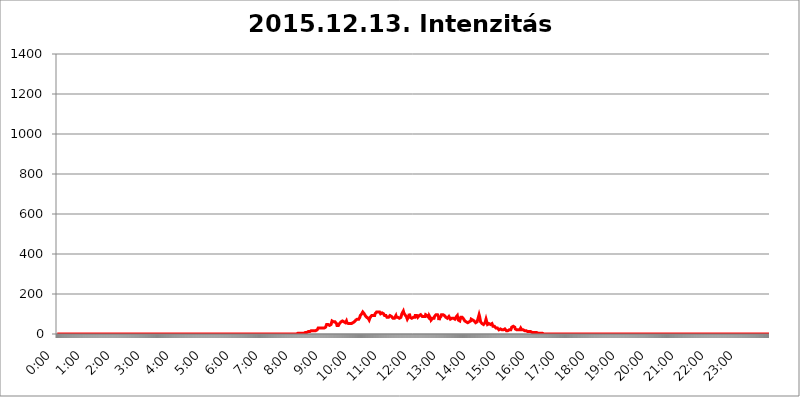
| Category | 2015.12.13. Intenzitás [W/m^2] |
|---|---|
| 0.0 | 0 |
| 0.0006944444444444445 | 0 |
| 0.001388888888888889 | 0 |
| 0.0020833333333333333 | 0 |
| 0.002777777777777778 | 0 |
| 0.003472222222222222 | 0 |
| 0.004166666666666667 | 0 |
| 0.004861111111111111 | 0 |
| 0.005555555555555556 | 0 |
| 0.0062499999999999995 | 0 |
| 0.006944444444444444 | 0 |
| 0.007638888888888889 | 0 |
| 0.008333333333333333 | 0 |
| 0.009027777777777779 | 0 |
| 0.009722222222222222 | 0 |
| 0.010416666666666666 | 0 |
| 0.011111111111111112 | 0 |
| 0.011805555555555555 | 0 |
| 0.012499999999999999 | 0 |
| 0.013194444444444444 | 0 |
| 0.013888888888888888 | 0 |
| 0.014583333333333332 | 0 |
| 0.015277777777777777 | 0 |
| 0.015972222222222224 | 0 |
| 0.016666666666666666 | 0 |
| 0.017361111111111112 | 0 |
| 0.018055555555555557 | 0 |
| 0.01875 | 0 |
| 0.019444444444444445 | 0 |
| 0.02013888888888889 | 0 |
| 0.020833333333333332 | 0 |
| 0.02152777777777778 | 0 |
| 0.022222222222222223 | 0 |
| 0.02291666666666667 | 0 |
| 0.02361111111111111 | 0 |
| 0.024305555555555556 | 0 |
| 0.024999999999999998 | 0 |
| 0.025694444444444447 | 0 |
| 0.02638888888888889 | 0 |
| 0.027083333333333334 | 0 |
| 0.027777777777777776 | 0 |
| 0.02847222222222222 | 0 |
| 0.029166666666666664 | 0 |
| 0.029861111111111113 | 0 |
| 0.030555555555555555 | 0 |
| 0.03125 | 0 |
| 0.03194444444444445 | 0 |
| 0.03263888888888889 | 0 |
| 0.03333333333333333 | 0 |
| 0.034027777777777775 | 0 |
| 0.034722222222222224 | 0 |
| 0.035416666666666666 | 0 |
| 0.036111111111111115 | 0 |
| 0.03680555555555556 | 0 |
| 0.0375 | 0 |
| 0.03819444444444444 | 0 |
| 0.03888888888888889 | 0 |
| 0.03958333333333333 | 0 |
| 0.04027777777777778 | 0 |
| 0.04097222222222222 | 0 |
| 0.041666666666666664 | 0 |
| 0.042361111111111106 | 0 |
| 0.04305555555555556 | 0 |
| 0.043750000000000004 | 0 |
| 0.044444444444444446 | 0 |
| 0.04513888888888889 | 0 |
| 0.04583333333333334 | 0 |
| 0.04652777777777778 | 0 |
| 0.04722222222222222 | 0 |
| 0.04791666666666666 | 0 |
| 0.04861111111111111 | 0 |
| 0.049305555555555554 | 0 |
| 0.049999999999999996 | 0 |
| 0.05069444444444445 | 0 |
| 0.051388888888888894 | 0 |
| 0.052083333333333336 | 0 |
| 0.05277777777777778 | 0 |
| 0.05347222222222222 | 0 |
| 0.05416666666666667 | 0 |
| 0.05486111111111111 | 0 |
| 0.05555555555555555 | 0 |
| 0.05625 | 0 |
| 0.05694444444444444 | 0 |
| 0.057638888888888885 | 0 |
| 0.05833333333333333 | 0 |
| 0.05902777777777778 | 0 |
| 0.059722222222222225 | 0 |
| 0.06041666666666667 | 0 |
| 0.061111111111111116 | 0 |
| 0.06180555555555556 | 0 |
| 0.0625 | 0 |
| 0.06319444444444444 | 0 |
| 0.06388888888888888 | 0 |
| 0.06458333333333334 | 0 |
| 0.06527777777777778 | 0 |
| 0.06597222222222222 | 0 |
| 0.06666666666666667 | 0 |
| 0.06736111111111111 | 0 |
| 0.06805555555555555 | 0 |
| 0.06874999999999999 | 0 |
| 0.06944444444444443 | 0 |
| 0.07013888888888889 | 0 |
| 0.07083333333333333 | 0 |
| 0.07152777777777779 | 0 |
| 0.07222222222222223 | 0 |
| 0.07291666666666667 | 0 |
| 0.07361111111111111 | 0 |
| 0.07430555555555556 | 0 |
| 0.075 | 0 |
| 0.07569444444444444 | 0 |
| 0.0763888888888889 | 0 |
| 0.07708333333333334 | 0 |
| 0.07777777777777778 | 0 |
| 0.07847222222222222 | 0 |
| 0.07916666666666666 | 0 |
| 0.0798611111111111 | 0 |
| 0.08055555555555556 | 0 |
| 0.08125 | 0 |
| 0.08194444444444444 | 0 |
| 0.08263888888888889 | 0 |
| 0.08333333333333333 | 0 |
| 0.08402777777777777 | 0 |
| 0.08472222222222221 | 0 |
| 0.08541666666666665 | 0 |
| 0.08611111111111112 | 0 |
| 0.08680555555555557 | 0 |
| 0.08750000000000001 | 0 |
| 0.08819444444444445 | 0 |
| 0.08888888888888889 | 0 |
| 0.08958333333333333 | 0 |
| 0.09027777777777778 | 0 |
| 0.09097222222222222 | 0 |
| 0.09166666666666667 | 0 |
| 0.09236111111111112 | 0 |
| 0.09305555555555556 | 0 |
| 0.09375 | 0 |
| 0.09444444444444444 | 0 |
| 0.09513888888888888 | 0 |
| 0.09583333333333333 | 0 |
| 0.09652777777777777 | 0 |
| 0.09722222222222222 | 0 |
| 0.09791666666666667 | 0 |
| 0.09861111111111111 | 0 |
| 0.09930555555555555 | 0 |
| 0.09999999999999999 | 0 |
| 0.10069444444444443 | 0 |
| 0.1013888888888889 | 0 |
| 0.10208333333333335 | 0 |
| 0.10277777777777779 | 0 |
| 0.10347222222222223 | 0 |
| 0.10416666666666667 | 0 |
| 0.10486111111111111 | 0 |
| 0.10555555555555556 | 0 |
| 0.10625 | 0 |
| 0.10694444444444444 | 0 |
| 0.1076388888888889 | 0 |
| 0.10833333333333334 | 0 |
| 0.10902777777777778 | 0 |
| 0.10972222222222222 | 0 |
| 0.1111111111111111 | 0 |
| 0.11180555555555556 | 0 |
| 0.11180555555555556 | 0 |
| 0.1125 | 0 |
| 0.11319444444444444 | 0 |
| 0.11388888888888889 | 0 |
| 0.11458333333333333 | 0 |
| 0.11527777777777777 | 0 |
| 0.11597222222222221 | 0 |
| 0.11666666666666665 | 0 |
| 0.1173611111111111 | 0 |
| 0.11805555555555557 | 0 |
| 0.11944444444444445 | 0 |
| 0.12013888888888889 | 0 |
| 0.12083333333333333 | 0 |
| 0.12152777777777778 | 0 |
| 0.12222222222222223 | 0 |
| 0.12291666666666667 | 0 |
| 0.12291666666666667 | 0 |
| 0.12361111111111112 | 0 |
| 0.12430555555555556 | 0 |
| 0.125 | 0 |
| 0.12569444444444444 | 0 |
| 0.12638888888888888 | 0 |
| 0.12708333333333333 | 0 |
| 0.16875 | 0 |
| 0.12847222222222224 | 0 |
| 0.12916666666666668 | 0 |
| 0.12986111111111112 | 0 |
| 0.13055555555555556 | 0 |
| 0.13125 | 0 |
| 0.13194444444444445 | 0 |
| 0.1326388888888889 | 0 |
| 0.13333333333333333 | 0 |
| 0.13402777777777777 | 0 |
| 0.13402777777777777 | 0 |
| 0.13472222222222222 | 0 |
| 0.13541666666666666 | 0 |
| 0.1361111111111111 | 0 |
| 0.13749999999999998 | 0 |
| 0.13819444444444443 | 0 |
| 0.1388888888888889 | 0 |
| 0.13958333333333334 | 0 |
| 0.14027777777777778 | 0 |
| 0.14097222222222222 | 0 |
| 0.14166666666666666 | 0 |
| 0.1423611111111111 | 0 |
| 0.14305555555555557 | 0 |
| 0.14375000000000002 | 0 |
| 0.14444444444444446 | 0 |
| 0.1451388888888889 | 0 |
| 0.1451388888888889 | 0 |
| 0.14652777777777778 | 0 |
| 0.14722222222222223 | 0 |
| 0.14791666666666667 | 0 |
| 0.1486111111111111 | 0 |
| 0.14930555555555555 | 0 |
| 0.15 | 0 |
| 0.15069444444444444 | 0 |
| 0.15138888888888888 | 0 |
| 0.15208333333333332 | 0 |
| 0.15277777777777776 | 0 |
| 0.15347222222222223 | 0 |
| 0.15416666666666667 | 0 |
| 0.15486111111111112 | 0 |
| 0.15555555555555556 | 0 |
| 0.15625 | 0 |
| 0.15694444444444444 | 0 |
| 0.15763888888888888 | 0 |
| 0.15833333333333333 | 0 |
| 0.15902777777777777 | 0 |
| 0.15972222222222224 | 0 |
| 0.16041666666666668 | 0 |
| 0.16111111111111112 | 0 |
| 0.16180555555555556 | 0 |
| 0.1625 | 0 |
| 0.16319444444444445 | 0 |
| 0.1638888888888889 | 0 |
| 0.16458333333333333 | 0 |
| 0.16527777777777777 | 0 |
| 0.16597222222222222 | 0 |
| 0.16666666666666666 | 0 |
| 0.1673611111111111 | 0 |
| 0.16805555555555554 | 0 |
| 0.16874999999999998 | 0 |
| 0.16944444444444443 | 0 |
| 0.17013888888888887 | 0 |
| 0.1708333333333333 | 0 |
| 0.17152777777777775 | 0 |
| 0.17222222222222225 | 0 |
| 0.1729166666666667 | 0 |
| 0.17361111111111113 | 0 |
| 0.17430555555555557 | 0 |
| 0.17500000000000002 | 0 |
| 0.17569444444444446 | 0 |
| 0.1763888888888889 | 0 |
| 0.17708333333333334 | 0 |
| 0.17777777777777778 | 0 |
| 0.17847222222222223 | 0 |
| 0.17916666666666667 | 0 |
| 0.1798611111111111 | 0 |
| 0.18055555555555555 | 0 |
| 0.18125 | 0 |
| 0.18194444444444444 | 0 |
| 0.1826388888888889 | 0 |
| 0.18333333333333335 | 0 |
| 0.1840277777777778 | 0 |
| 0.18472222222222223 | 0 |
| 0.18541666666666667 | 0 |
| 0.18611111111111112 | 0 |
| 0.18680555555555556 | 0 |
| 0.1875 | 0 |
| 0.18819444444444444 | 0 |
| 0.18888888888888888 | 0 |
| 0.18958333333333333 | 0 |
| 0.19027777777777777 | 0 |
| 0.1909722222222222 | 0 |
| 0.19166666666666665 | 0 |
| 0.19236111111111112 | 0 |
| 0.19305555555555554 | 0 |
| 0.19375 | 0 |
| 0.19444444444444445 | 0 |
| 0.1951388888888889 | 0 |
| 0.19583333333333333 | 0 |
| 0.19652777777777777 | 0 |
| 0.19722222222222222 | 0 |
| 0.19791666666666666 | 0 |
| 0.1986111111111111 | 0 |
| 0.19930555555555554 | 0 |
| 0.19999999999999998 | 0 |
| 0.20069444444444443 | 0 |
| 0.20138888888888887 | 0 |
| 0.2020833333333333 | 0 |
| 0.2027777777777778 | 0 |
| 0.2034722222222222 | 0 |
| 0.2041666666666667 | 0 |
| 0.20486111111111113 | 0 |
| 0.20555555555555557 | 0 |
| 0.20625000000000002 | 0 |
| 0.20694444444444446 | 0 |
| 0.2076388888888889 | 0 |
| 0.20833333333333334 | 0 |
| 0.20902777777777778 | 0 |
| 0.20972222222222223 | 0 |
| 0.21041666666666667 | 0 |
| 0.2111111111111111 | 0 |
| 0.21180555555555555 | 0 |
| 0.2125 | 0 |
| 0.21319444444444444 | 0 |
| 0.2138888888888889 | 0 |
| 0.21458333333333335 | 0 |
| 0.2152777777777778 | 0 |
| 0.21597222222222223 | 0 |
| 0.21666666666666667 | 0 |
| 0.21736111111111112 | 0 |
| 0.21805555555555556 | 0 |
| 0.21875 | 0 |
| 0.21944444444444444 | 0 |
| 0.22013888888888888 | 0 |
| 0.22083333333333333 | 0 |
| 0.22152777777777777 | 0 |
| 0.2222222222222222 | 0 |
| 0.22291666666666665 | 0 |
| 0.2236111111111111 | 0 |
| 0.22430555555555556 | 0 |
| 0.225 | 0 |
| 0.22569444444444445 | 0 |
| 0.2263888888888889 | 0 |
| 0.22708333333333333 | 0 |
| 0.22777777777777777 | 0 |
| 0.22847222222222222 | 0 |
| 0.22916666666666666 | 0 |
| 0.2298611111111111 | 0 |
| 0.23055555555555554 | 0 |
| 0.23124999999999998 | 0 |
| 0.23194444444444443 | 0 |
| 0.23263888888888887 | 0 |
| 0.2333333333333333 | 0 |
| 0.2340277777777778 | 0 |
| 0.2347222222222222 | 0 |
| 0.2354166666666667 | 0 |
| 0.23611111111111113 | 0 |
| 0.23680555555555557 | 0 |
| 0.23750000000000002 | 0 |
| 0.23819444444444446 | 0 |
| 0.2388888888888889 | 0 |
| 0.23958333333333334 | 0 |
| 0.24027777777777778 | 0 |
| 0.24097222222222223 | 0 |
| 0.24166666666666667 | 0 |
| 0.2423611111111111 | 0 |
| 0.24305555555555555 | 0 |
| 0.24375 | 0 |
| 0.24444444444444446 | 0 |
| 0.24513888888888888 | 0 |
| 0.24583333333333335 | 0 |
| 0.2465277777777778 | 0 |
| 0.24722222222222223 | 0 |
| 0.24791666666666667 | 0 |
| 0.24861111111111112 | 0 |
| 0.24930555555555556 | 0 |
| 0.25 | 0 |
| 0.25069444444444444 | 0 |
| 0.2513888888888889 | 0 |
| 0.2520833333333333 | 0 |
| 0.25277777777777777 | 0 |
| 0.2534722222222222 | 0 |
| 0.25416666666666665 | 0 |
| 0.2548611111111111 | 0 |
| 0.2555555555555556 | 0 |
| 0.25625000000000003 | 0 |
| 0.2569444444444445 | 0 |
| 0.2576388888888889 | 0 |
| 0.25833333333333336 | 0 |
| 0.2590277777777778 | 0 |
| 0.25972222222222224 | 0 |
| 0.2604166666666667 | 0 |
| 0.2611111111111111 | 0 |
| 0.26180555555555557 | 0 |
| 0.2625 | 0 |
| 0.26319444444444445 | 0 |
| 0.2638888888888889 | 0 |
| 0.26458333333333334 | 0 |
| 0.2652777777777778 | 0 |
| 0.2659722222222222 | 0 |
| 0.26666666666666666 | 0 |
| 0.2673611111111111 | 0 |
| 0.26805555555555555 | 0 |
| 0.26875 | 0 |
| 0.26944444444444443 | 0 |
| 0.2701388888888889 | 0 |
| 0.2708333333333333 | 0 |
| 0.27152777777777776 | 0 |
| 0.2722222222222222 | 0 |
| 0.27291666666666664 | 0 |
| 0.2736111111111111 | 0 |
| 0.2743055555555555 | 0 |
| 0.27499999999999997 | 0 |
| 0.27569444444444446 | 0 |
| 0.27638888888888885 | 0 |
| 0.27708333333333335 | 0 |
| 0.2777777777777778 | 0 |
| 0.27847222222222223 | 0 |
| 0.2791666666666667 | 0 |
| 0.2798611111111111 | 0 |
| 0.28055555555555556 | 0 |
| 0.28125 | 0 |
| 0.28194444444444444 | 0 |
| 0.2826388888888889 | 0 |
| 0.2833333333333333 | 0 |
| 0.28402777777777777 | 0 |
| 0.2847222222222222 | 0 |
| 0.28541666666666665 | 0 |
| 0.28611111111111115 | 0 |
| 0.28680555555555554 | 0 |
| 0.28750000000000003 | 0 |
| 0.2881944444444445 | 0 |
| 0.2888888888888889 | 0 |
| 0.28958333333333336 | 0 |
| 0.2902777777777778 | 0 |
| 0.29097222222222224 | 0 |
| 0.2916666666666667 | 0 |
| 0.2923611111111111 | 0 |
| 0.29305555555555557 | 0 |
| 0.29375 | 0 |
| 0.29444444444444445 | 0 |
| 0.2951388888888889 | 0 |
| 0.29583333333333334 | 0 |
| 0.2965277777777778 | 0 |
| 0.2972222222222222 | 0 |
| 0.29791666666666666 | 0 |
| 0.2986111111111111 | 0 |
| 0.29930555555555555 | 0 |
| 0.3 | 0 |
| 0.30069444444444443 | 0 |
| 0.3013888888888889 | 0 |
| 0.3020833333333333 | 0 |
| 0.30277777777777776 | 0 |
| 0.3034722222222222 | 0 |
| 0.30416666666666664 | 0 |
| 0.3048611111111111 | 0 |
| 0.3055555555555555 | 0 |
| 0.30624999999999997 | 0 |
| 0.3069444444444444 | 0 |
| 0.3076388888888889 | 0 |
| 0.30833333333333335 | 0 |
| 0.3090277777777778 | 0 |
| 0.30972222222222223 | 0 |
| 0.3104166666666667 | 0 |
| 0.3111111111111111 | 0 |
| 0.31180555555555556 | 0 |
| 0.3125 | 0 |
| 0.31319444444444444 | 0 |
| 0.3138888888888889 | 0 |
| 0.3145833333333333 | 0 |
| 0.31527777777777777 | 0 |
| 0.3159722222222222 | 0 |
| 0.31666666666666665 | 0 |
| 0.31736111111111115 | 0 |
| 0.31805555555555554 | 0 |
| 0.31875000000000003 | 0 |
| 0.3194444444444445 | 0 |
| 0.3201388888888889 | 0 |
| 0.32083333333333336 | 0 |
| 0.3215277777777778 | 0 |
| 0.32222222222222224 | 0 |
| 0.3229166666666667 | 0 |
| 0.3236111111111111 | 0 |
| 0.32430555555555557 | 0 |
| 0.325 | 0 |
| 0.32569444444444445 | 0 |
| 0.3263888888888889 | 0 |
| 0.32708333333333334 | 0 |
| 0.3277777777777778 | 0 |
| 0.3284722222222222 | 0 |
| 0.32916666666666666 | 0 |
| 0.3298611111111111 | 0 |
| 0.33055555555555555 | 0 |
| 0.33125 | 0 |
| 0.33194444444444443 | 0 |
| 0.3326388888888889 | 0 |
| 0.3333333333333333 | 0 |
| 0.3340277777777778 | 0 |
| 0.3347222222222222 | 0 |
| 0.3354166666666667 | 0 |
| 0.3361111111111111 | 0 |
| 0.3368055555555556 | 0 |
| 0.33749999999999997 | 3.525 |
| 0.33819444444444446 | 3.525 |
| 0.33888888888888885 | 3.525 |
| 0.33958333333333335 | 3.525 |
| 0.34027777777777773 | 3.525 |
| 0.34097222222222223 | 3.525 |
| 0.3416666666666666 | 3.525 |
| 0.3423611111111111 | 3.525 |
| 0.3430555555555555 | 3.525 |
| 0.34375 | 3.525 |
| 0.3444444444444445 | 3.525 |
| 0.3451388888888889 | 7.887 |
| 0.3458333333333334 | 3.525 |
| 0.34652777777777777 | 7.887 |
| 0.34722222222222227 | 7.887 |
| 0.34791666666666665 | 7.887 |
| 0.34861111111111115 | 7.887 |
| 0.34930555555555554 | 7.887 |
| 0.35000000000000003 | 7.887 |
| 0.3506944444444444 | 7.887 |
| 0.3513888888888889 | 12.257 |
| 0.3520833333333333 | 12.257 |
| 0.3527777777777778 | 12.257 |
| 0.3534722222222222 | 12.257 |
| 0.3541666666666667 | 12.257 |
| 0.3548611111111111 | 16.636 |
| 0.35555555555555557 | 16.636 |
| 0.35625 | 16.636 |
| 0.35694444444444445 | 16.636 |
| 0.3576388888888889 | 16.636 |
| 0.35833333333333334 | 16.636 |
| 0.3590277777777778 | 16.636 |
| 0.3597222222222222 | 16.636 |
| 0.36041666666666666 | 16.636 |
| 0.3611111111111111 | 16.636 |
| 0.36180555555555555 | 16.636 |
| 0.3625 | 16.636 |
| 0.36319444444444443 | 16.636 |
| 0.3638888888888889 | 16.636 |
| 0.3645833333333333 | 21.024 |
| 0.3652777777777778 | 21.024 |
| 0.3659722222222222 | 29.823 |
| 0.3666666666666667 | 29.823 |
| 0.3673611111111111 | 29.823 |
| 0.3680555555555556 | 29.823 |
| 0.36874999999999997 | 29.823 |
| 0.36944444444444446 | 29.823 |
| 0.37013888888888885 | 29.823 |
| 0.37083333333333335 | 29.823 |
| 0.37152777777777773 | 29.823 |
| 0.37222222222222223 | 29.823 |
| 0.3729166666666666 | 29.823 |
| 0.3736111111111111 | 29.823 |
| 0.3743055555555555 | 29.823 |
| 0.375 | 34.234 |
| 0.3756944444444445 | 29.823 |
| 0.3763888888888889 | 34.234 |
| 0.3770833333333334 | 38.653 |
| 0.37777777777777777 | 47.511 |
| 0.37847222222222227 | 51.951 |
| 0.37916666666666665 | 51.951 |
| 0.37986111111111115 | 47.511 |
| 0.38055555555555554 | 43.079 |
| 0.38125000000000003 | 43.079 |
| 0.3819444444444444 | 43.079 |
| 0.3826388888888889 | 47.511 |
| 0.3833333333333333 | 47.511 |
| 0.3840277777777778 | 47.511 |
| 0.3847222222222222 | 56.398 |
| 0.3854166666666667 | 65.31 |
| 0.3861111111111111 | 69.775 |
| 0.38680555555555557 | 60.85 |
| 0.3875 | 60.85 |
| 0.38819444444444445 | 65.31 |
| 0.3888888888888889 | 56.398 |
| 0.38958333333333334 | 60.85 |
| 0.3902777777777778 | 65.31 |
| 0.3909722222222222 | 56.398 |
| 0.39166666666666666 | 51.951 |
| 0.3923611111111111 | 43.079 |
| 0.39305555555555555 | 43.079 |
| 0.39375 | 43.079 |
| 0.39444444444444443 | 43.079 |
| 0.3951388888888889 | 47.511 |
| 0.3958333333333333 | 51.951 |
| 0.3965277777777778 | 51.951 |
| 0.3972222222222222 | 56.398 |
| 0.3979166666666667 | 60.85 |
| 0.3986111111111111 | 60.85 |
| 0.3993055555555556 | 60.85 |
| 0.39999999999999997 | 65.31 |
| 0.40069444444444446 | 65.31 |
| 0.40138888888888885 | 65.31 |
| 0.40208333333333335 | 60.85 |
| 0.40277777777777773 | 56.398 |
| 0.40347222222222223 | 56.398 |
| 0.4041666666666666 | 56.398 |
| 0.4048611111111111 | 56.398 |
| 0.4055555555555555 | 65.31 |
| 0.40625 | 56.398 |
| 0.4069444444444445 | 60.85 |
| 0.4076388888888889 | 56.398 |
| 0.4083333333333334 | 51.951 |
| 0.40902777777777777 | 51.951 |
| 0.40972222222222227 | 56.398 |
| 0.41041666666666665 | 51.951 |
| 0.41111111111111115 | 47.511 |
| 0.41180555555555554 | 51.951 |
| 0.41250000000000003 | 51.951 |
| 0.4131944444444444 | 51.951 |
| 0.4138888888888889 | 47.511 |
| 0.4145833333333333 | 56.398 |
| 0.4152777777777778 | 56.398 |
| 0.4159722222222222 | 56.398 |
| 0.4166666666666667 | 60.85 |
| 0.4173611111111111 | 65.31 |
| 0.41805555555555557 | 65.31 |
| 0.41875 | 69.775 |
| 0.41944444444444445 | 69.775 |
| 0.4201388888888889 | 69.775 |
| 0.42083333333333334 | 74.246 |
| 0.4215277777777778 | 74.246 |
| 0.4222222222222222 | 78.722 |
| 0.42291666666666666 | 74.246 |
| 0.4236111111111111 | 78.722 |
| 0.42430555555555555 | 83.205 |
| 0.425 | 92.184 |
| 0.42569444444444443 | 87.692 |
| 0.4263888888888889 | 96.682 |
| 0.4270833333333333 | 101.184 |
| 0.4277777777777778 | 96.682 |
| 0.4284722222222222 | 110.201 |
| 0.4291666666666667 | 114.716 |
| 0.4298611111111111 | 110.201 |
| 0.4305555555555556 | 101.184 |
| 0.43124999999999997 | 101.184 |
| 0.43194444444444446 | 92.184 |
| 0.43263888888888885 | 87.692 |
| 0.43333333333333335 | 87.692 |
| 0.43402777777777773 | 83.205 |
| 0.43472222222222223 | 78.722 |
| 0.4354166666666666 | 78.722 |
| 0.4361111111111111 | 78.722 |
| 0.4368055555555555 | 74.246 |
| 0.4375 | 69.775 |
| 0.4381944444444445 | 74.246 |
| 0.4388888888888889 | 83.205 |
| 0.4395833333333334 | 87.692 |
| 0.44027777777777777 | 87.692 |
| 0.44097222222222227 | 92.184 |
| 0.44166666666666665 | 92.184 |
| 0.44236111111111115 | 96.682 |
| 0.44305555555555554 | 92.184 |
| 0.44375000000000003 | 96.682 |
| 0.4444444444444444 | 92.184 |
| 0.4451388888888889 | 92.184 |
| 0.4458333333333333 | 101.184 |
| 0.4465277777777778 | 101.184 |
| 0.4472222222222222 | 105.69 |
| 0.4479166666666667 | 110.201 |
| 0.4486111111111111 | 110.201 |
| 0.44930555555555557 | 110.201 |
| 0.45 | 110.201 |
| 0.45069444444444445 | 110.201 |
| 0.4513888888888889 | 110.201 |
| 0.45208333333333334 | 110.201 |
| 0.4527777777777778 | 105.69 |
| 0.4534722222222222 | 101.184 |
| 0.45416666666666666 | 101.184 |
| 0.4548611111111111 | 101.184 |
| 0.45555555555555555 | 105.69 |
| 0.45625 | 105.69 |
| 0.45694444444444443 | 105.69 |
| 0.4576388888888889 | 101.184 |
| 0.4583333333333333 | 96.682 |
| 0.4590277777777778 | 92.184 |
| 0.4597222222222222 | 92.184 |
| 0.4604166666666667 | 96.682 |
| 0.4611111111111111 | 92.184 |
| 0.4618055555555556 | 87.692 |
| 0.46249999999999997 | 83.205 |
| 0.46319444444444446 | 83.205 |
| 0.46388888888888885 | 83.205 |
| 0.46458333333333335 | 83.205 |
| 0.46527777777777773 | 83.205 |
| 0.46597222222222223 | 87.692 |
| 0.4666666666666666 | 92.184 |
| 0.4673611111111111 | 92.184 |
| 0.4680555555555555 | 92.184 |
| 0.46875 | 87.692 |
| 0.4694444444444445 | 92.184 |
| 0.4701388888888889 | 83.205 |
| 0.4708333333333334 | 78.722 |
| 0.47152777777777777 | 78.722 |
| 0.47222222222222227 | 74.246 |
| 0.47291666666666665 | 78.722 |
| 0.47361111111111115 | 78.722 |
| 0.47430555555555554 | 83.205 |
| 0.47500000000000003 | 92.184 |
| 0.4756944444444444 | 83.205 |
| 0.4763888888888889 | 78.722 |
| 0.4770833333333333 | 78.722 |
| 0.4777777777777778 | 83.205 |
| 0.4784722222222222 | 78.722 |
| 0.4791666666666667 | 78.722 |
| 0.4798611111111111 | 78.722 |
| 0.48055555555555557 | 74.246 |
| 0.48125 | 83.205 |
| 0.48194444444444445 | 83.205 |
| 0.4826388888888889 | 92.184 |
| 0.48333333333333334 | 101.184 |
| 0.4840277777777778 | 101.184 |
| 0.4847222222222222 | 105.69 |
| 0.48541666666666666 | 114.716 |
| 0.4861111111111111 | 105.69 |
| 0.48680555555555555 | 101.184 |
| 0.4875 | 96.682 |
| 0.48819444444444443 | 96.682 |
| 0.4888888888888889 | 92.184 |
| 0.4895833333333333 | 87.692 |
| 0.4902777777777778 | 83.205 |
| 0.4909722222222222 | 74.246 |
| 0.4916666666666667 | 74.246 |
| 0.4923611111111111 | 78.722 |
| 0.4930555555555556 | 87.692 |
| 0.49374999999999997 | 101.184 |
| 0.49444444444444446 | 92.184 |
| 0.49513888888888885 | 83.205 |
| 0.49583333333333335 | 83.205 |
| 0.49652777777777773 | 83.205 |
| 0.49722222222222223 | 78.722 |
| 0.4979166666666666 | 78.722 |
| 0.4986111111111111 | 83.205 |
| 0.4993055555555555 | 83.205 |
| 0.5 | 78.722 |
| 0.5006944444444444 | 78.722 |
| 0.5013888888888889 | 83.205 |
| 0.5020833333333333 | 92.184 |
| 0.5027777777777778 | 96.682 |
| 0.5034722222222222 | 92.184 |
| 0.5041666666666667 | 92.184 |
| 0.5048611111111111 | 87.692 |
| 0.5055555555555555 | 83.205 |
| 0.50625 | 78.722 |
| 0.5069444444444444 | 87.692 |
| 0.5076388888888889 | 92.184 |
| 0.5083333333333333 | 92.184 |
| 0.5090277777777777 | 96.682 |
| 0.5097222222222222 | 96.682 |
| 0.5104166666666666 | 92.184 |
| 0.5111111111111112 | 92.184 |
| 0.5118055555555555 | 87.692 |
| 0.5125000000000001 | 92.184 |
| 0.5131944444444444 | 92.184 |
| 0.513888888888889 | 87.692 |
| 0.5145833333333333 | 87.692 |
| 0.5152777777777778 | 92.184 |
| 0.5159722222222222 | 87.692 |
| 0.5166666666666667 | 96.682 |
| 0.517361111111111 | 96.682 |
| 0.5180555555555556 | 96.682 |
| 0.5187499999999999 | 92.184 |
| 0.5194444444444445 | 92.184 |
| 0.5201388888888888 | 87.692 |
| 0.5208333333333334 | 83.205 |
| 0.5215277777777778 | 92.184 |
| 0.5222222222222223 | 96.682 |
| 0.5229166666666667 | 92.184 |
| 0.5236111111111111 | 78.722 |
| 0.5243055555555556 | 69.775 |
| 0.525 | 65.31 |
| 0.5256944444444445 | 69.775 |
| 0.5263888888888889 | 78.722 |
| 0.5270833333333333 | 78.722 |
| 0.5277777777777778 | 78.722 |
| 0.5284722222222222 | 78.722 |
| 0.5291666666666667 | 87.692 |
| 0.5298611111111111 | 92.184 |
| 0.5305555555555556 | 92.184 |
| 0.53125 | 96.682 |
| 0.5319444444444444 | 96.682 |
| 0.5326388888888889 | 96.682 |
| 0.5333333333333333 | 96.682 |
| 0.5340277777777778 | 96.682 |
| 0.5347222222222222 | 87.692 |
| 0.5354166666666667 | 69.775 |
| 0.5361111111111111 | 78.722 |
| 0.5368055555555555 | 83.205 |
| 0.5375 | 83.205 |
| 0.5381944444444444 | 87.692 |
| 0.5388888888888889 | 96.682 |
| 0.5395833333333333 | 92.184 |
| 0.5402777777777777 | 92.184 |
| 0.5409722222222222 | 96.682 |
| 0.5416666666666666 | 92.184 |
| 0.5423611111111112 | 96.682 |
| 0.5430555555555555 | 92.184 |
| 0.5437500000000001 | 92.184 |
| 0.5444444444444444 | 87.692 |
| 0.545138888888889 | 83.205 |
| 0.5458333333333333 | 83.205 |
| 0.5465277777777778 | 78.722 |
| 0.5472222222222222 | 78.722 |
| 0.5479166666666667 | 78.722 |
| 0.548611111111111 | 78.722 |
| 0.5493055555555556 | 87.692 |
| 0.5499999999999999 | 83.205 |
| 0.5506944444444445 | 83.205 |
| 0.5513888888888888 | 74.246 |
| 0.5520833333333334 | 74.246 |
| 0.5527777777777778 | 78.722 |
| 0.5534722222222223 | 78.722 |
| 0.5541666666666667 | 83.205 |
| 0.5548611111111111 | 83.205 |
| 0.5555555555555556 | 78.722 |
| 0.55625 | 74.246 |
| 0.5569444444444445 | 74.246 |
| 0.5576388888888889 | 74.246 |
| 0.5583333333333333 | 78.722 |
| 0.5590277777777778 | 83.205 |
| 0.5597222222222222 | 83.205 |
| 0.5604166666666667 | 87.692 |
| 0.5611111111111111 | 92.184 |
| 0.5618055555555556 | 78.722 |
| 0.5625 | 69.775 |
| 0.5631944444444444 | 65.31 |
| 0.5638888888888889 | 65.31 |
| 0.5645833333333333 | 65.31 |
| 0.5652777777777778 | 74.246 |
| 0.5659722222222222 | 83.205 |
| 0.5666666666666667 | 87.692 |
| 0.5673611111111111 | 87.692 |
| 0.5680555555555555 | 83.205 |
| 0.56875 | 87.692 |
| 0.5694444444444444 | 83.205 |
| 0.5701388888888889 | 74.246 |
| 0.5708333333333333 | 78.722 |
| 0.5715277777777777 | 65.31 |
| 0.5722222222222222 | 65.31 |
| 0.5729166666666666 | 60.85 |
| 0.5736111111111112 | 60.85 |
| 0.5743055555555555 | 60.85 |
| 0.5750000000000001 | 56.398 |
| 0.5756944444444444 | 56.398 |
| 0.576388888888889 | 60.85 |
| 0.5770833333333333 | 56.398 |
| 0.5777777777777778 | 60.85 |
| 0.5784722222222222 | 60.85 |
| 0.5791666666666667 | 60.85 |
| 0.579861111111111 | 65.31 |
| 0.5805555555555556 | 74.246 |
| 0.5812499999999999 | 74.246 |
| 0.5819444444444445 | 74.246 |
| 0.5826388888888888 | 69.775 |
| 0.5833333333333334 | 65.31 |
| 0.5840277777777778 | 65.31 |
| 0.5847222222222223 | 65.31 |
| 0.5854166666666667 | 65.31 |
| 0.5861111111111111 | 60.85 |
| 0.5868055555555556 | 56.398 |
| 0.5875 | 60.85 |
| 0.5881944444444445 | 56.398 |
| 0.5888888888888889 | 60.85 |
| 0.5895833333333333 | 69.775 |
| 0.5902777777777778 | 74.246 |
| 0.5909722222222222 | 87.692 |
| 0.5916666666666667 | 96.682 |
| 0.5923611111111111 | 87.692 |
| 0.5930555555555556 | 74.246 |
| 0.59375 | 60.85 |
| 0.5944444444444444 | 56.398 |
| 0.5951388888888889 | 56.398 |
| 0.5958333333333333 | 51.951 |
| 0.5965277777777778 | 51.951 |
| 0.5972222222222222 | 51.951 |
| 0.5979166666666667 | 47.511 |
| 0.5986111111111111 | 51.951 |
| 0.5993055555555555 | 51.951 |
| 0.6 | 56.398 |
| 0.6006944444444444 | 65.31 |
| 0.6013888888888889 | 74.246 |
| 0.6020833333333333 | 74.246 |
| 0.6027777777777777 | 56.398 |
| 0.6034722222222222 | 47.511 |
| 0.6041666666666666 | 47.511 |
| 0.6048611111111112 | 47.511 |
| 0.6055555555555555 | 51.951 |
| 0.6062500000000001 | 51.951 |
| 0.6069444444444444 | 51.951 |
| 0.607638888888889 | 47.511 |
| 0.6083333333333333 | 51.951 |
| 0.6090277777777778 | 47.511 |
| 0.6097222222222222 | 51.951 |
| 0.6104166666666667 | 47.511 |
| 0.611111111111111 | 38.653 |
| 0.6118055555555556 | 34.234 |
| 0.6124999999999999 | 34.234 |
| 0.6131944444444445 | 38.653 |
| 0.6138888888888888 | 38.653 |
| 0.6145833333333334 | 34.234 |
| 0.6152777777777778 | 29.823 |
| 0.6159722222222223 | 29.823 |
| 0.6166666666666667 | 29.823 |
| 0.6173611111111111 | 29.823 |
| 0.6180555555555556 | 25.419 |
| 0.61875 | 25.419 |
| 0.6194444444444445 | 21.024 |
| 0.6201388888888889 | 21.024 |
| 0.6208333333333333 | 21.024 |
| 0.6215277777777778 | 25.419 |
| 0.6222222222222222 | 25.419 |
| 0.6229166666666667 | 21.024 |
| 0.6236111111111111 | 21.024 |
| 0.6243055555555556 | 21.024 |
| 0.625 | 21.024 |
| 0.6256944444444444 | 21.024 |
| 0.6263888888888889 | 21.024 |
| 0.6270833333333333 | 25.419 |
| 0.6277777777777778 | 25.419 |
| 0.6284722222222222 | 21.024 |
| 0.6291666666666667 | 21.024 |
| 0.6298611111111111 | 16.636 |
| 0.6305555555555555 | 16.636 |
| 0.63125 | 16.636 |
| 0.6319444444444444 | 16.636 |
| 0.6326388888888889 | 16.636 |
| 0.6333333333333333 | 16.636 |
| 0.6340277777777777 | 21.024 |
| 0.6347222222222222 | 21.024 |
| 0.6354166666666666 | 25.419 |
| 0.6361111111111112 | 21.024 |
| 0.6368055555555555 | 25.419 |
| 0.6375000000000001 | 34.234 |
| 0.6381944444444444 | 38.653 |
| 0.638888888888889 | 29.823 |
| 0.6395833333333333 | 38.653 |
| 0.6402777777777778 | 34.234 |
| 0.6409722222222222 | 34.234 |
| 0.6416666666666667 | 34.234 |
| 0.642361111111111 | 25.419 |
| 0.6430555555555556 | 25.419 |
| 0.6437499999999999 | 25.419 |
| 0.6444444444444445 | 21.024 |
| 0.6451388888888888 | 21.024 |
| 0.6458333333333334 | 16.636 |
| 0.6465277777777778 | 21.024 |
| 0.6472222222222223 | 21.024 |
| 0.6479166666666667 | 21.024 |
| 0.6486111111111111 | 21.024 |
| 0.6493055555555556 | 25.419 |
| 0.65 | 29.823 |
| 0.6506944444444445 | 25.419 |
| 0.6513888888888889 | 21.024 |
| 0.6520833333333333 | 21.024 |
| 0.6527777777777778 | 25.419 |
| 0.6534722222222222 | 21.024 |
| 0.6541666666666667 | 21.024 |
| 0.6548611111111111 | 21.024 |
| 0.6555555555555556 | 16.636 |
| 0.65625 | 16.636 |
| 0.6569444444444444 | 16.636 |
| 0.6576388888888889 | 16.636 |
| 0.6583333333333333 | 16.636 |
| 0.6590277777777778 | 16.636 |
| 0.6597222222222222 | 12.257 |
| 0.6604166666666667 | 12.257 |
| 0.6611111111111111 | 12.257 |
| 0.6618055555555555 | 12.257 |
| 0.6625 | 12.257 |
| 0.6631944444444444 | 7.887 |
| 0.6638888888888889 | 12.257 |
| 0.6645833333333333 | 7.887 |
| 0.6652777777777777 | 7.887 |
| 0.6659722222222222 | 7.887 |
| 0.6666666666666666 | 7.887 |
| 0.6673611111111111 | 7.887 |
| 0.6680555555555556 | 7.887 |
| 0.6687500000000001 | 7.887 |
| 0.6694444444444444 | 7.887 |
| 0.6701388888888888 | 7.887 |
| 0.6708333333333334 | 7.887 |
| 0.6715277777777778 | 7.887 |
| 0.6722222222222222 | 7.887 |
| 0.6729166666666666 | 3.525 |
| 0.6736111111111112 | 3.525 |
| 0.6743055555555556 | 3.525 |
| 0.6749999999999999 | 3.525 |
| 0.6756944444444444 | 3.525 |
| 0.6763888888888889 | 3.525 |
| 0.6770833333333334 | 3.525 |
| 0.6777777777777777 | 3.525 |
| 0.6784722222222223 | 3.525 |
| 0.6791666666666667 | 3.525 |
| 0.6798611111111111 | 3.525 |
| 0.6805555555555555 | 3.525 |
| 0.68125 | 3.525 |
| 0.6819444444444445 | 0 |
| 0.6826388888888889 | 0 |
| 0.6833333333333332 | 0 |
| 0.6840277777777778 | 0 |
| 0.6847222222222222 | 0 |
| 0.6854166666666667 | 0 |
| 0.686111111111111 | 0 |
| 0.6868055555555556 | 0 |
| 0.6875 | 0 |
| 0.6881944444444444 | 0 |
| 0.688888888888889 | 0 |
| 0.6895833333333333 | 0 |
| 0.6902777777777778 | 0 |
| 0.6909722222222222 | 0 |
| 0.6916666666666668 | 0 |
| 0.6923611111111111 | 0 |
| 0.6930555555555555 | 0 |
| 0.69375 | 0 |
| 0.6944444444444445 | 0 |
| 0.6951388888888889 | 0 |
| 0.6958333333333333 | 0 |
| 0.6965277777777777 | 0 |
| 0.6972222222222223 | 0 |
| 0.6979166666666666 | 0 |
| 0.6986111111111111 | 0 |
| 0.6993055555555556 | 0 |
| 0.7000000000000001 | 0 |
| 0.7006944444444444 | 0 |
| 0.7013888888888888 | 0 |
| 0.7020833333333334 | 0 |
| 0.7027777777777778 | 0 |
| 0.7034722222222222 | 0 |
| 0.7041666666666666 | 0 |
| 0.7048611111111112 | 0 |
| 0.7055555555555556 | 0 |
| 0.7062499999999999 | 0 |
| 0.7069444444444444 | 0 |
| 0.7076388888888889 | 0 |
| 0.7083333333333334 | 0 |
| 0.7090277777777777 | 0 |
| 0.7097222222222223 | 0 |
| 0.7104166666666667 | 0 |
| 0.7111111111111111 | 0 |
| 0.7118055555555555 | 0 |
| 0.7125 | 0 |
| 0.7131944444444445 | 0 |
| 0.7138888888888889 | 0 |
| 0.7145833333333332 | 0 |
| 0.7152777777777778 | 0 |
| 0.7159722222222222 | 0 |
| 0.7166666666666667 | 0 |
| 0.717361111111111 | 0 |
| 0.7180555555555556 | 0 |
| 0.71875 | 0 |
| 0.7194444444444444 | 0 |
| 0.720138888888889 | 0 |
| 0.7208333333333333 | 0 |
| 0.7215277777777778 | 0 |
| 0.7222222222222222 | 0 |
| 0.7229166666666668 | 0 |
| 0.7236111111111111 | 0 |
| 0.7243055555555555 | 0 |
| 0.725 | 0 |
| 0.7256944444444445 | 0 |
| 0.7263888888888889 | 0 |
| 0.7270833333333333 | 0 |
| 0.7277777777777777 | 0 |
| 0.7284722222222223 | 0 |
| 0.7291666666666666 | 0 |
| 0.7298611111111111 | 0 |
| 0.7305555555555556 | 0 |
| 0.7312500000000001 | 0 |
| 0.7319444444444444 | 0 |
| 0.7326388888888888 | 0 |
| 0.7333333333333334 | 0 |
| 0.7340277777777778 | 0 |
| 0.7347222222222222 | 0 |
| 0.7354166666666666 | 0 |
| 0.7361111111111112 | 0 |
| 0.7368055555555556 | 0 |
| 0.7374999999999999 | 0 |
| 0.7381944444444444 | 0 |
| 0.7388888888888889 | 0 |
| 0.7395833333333334 | 0 |
| 0.7402777777777777 | 0 |
| 0.7409722222222223 | 0 |
| 0.7416666666666667 | 0 |
| 0.7423611111111111 | 0 |
| 0.7430555555555555 | 0 |
| 0.74375 | 0 |
| 0.7444444444444445 | 0 |
| 0.7451388888888889 | 0 |
| 0.7458333333333332 | 0 |
| 0.7465277777777778 | 0 |
| 0.7472222222222222 | 0 |
| 0.7479166666666667 | 0 |
| 0.748611111111111 | 0 |
| 0.7493055555555556 | 0 |
| 0.75 | 0 |
| 0.7506944444444444 | 0 |
| 0.751388888888889 | 0 |
| 0.7520833333333333 | 0 |
| 0.7527777777777778 | 0 |
| 0.7534722222222222 | 0 |
| 0.7541666666666668 | 0 |
| 0.7548611111111111 | 0 |
| 0.7555555555555555 | 0 |
| 0.75625 | 0 |
| 0.7569444444444445 | 0 |
| 0.7576388888888889 | 0 |
| 0.7583333333333333 | 0 |
| 0.7590277777777777 | 0 |
| 0.7597222222222223 | 0 |
| 0.7604166666666666 | 0 |
| 0.7611111111111111 | 0 |
| 0.7618055555555556 | 0 |
| 0.7625000000000001 | 0 |
| 0.7631944444444444 | 0 |
| 0.7638888888888888 | 0 |
| 0.7645833333333334 | 0 |
| 0.7652777777777778 | 0 |
| 0.7659722222222222 | 0 |
| 0.7666666666666666 | 0 |
| 0.7673611111111112 | 0 |
| 0.7680555555555556 | 0 |
| 0.7687499999999999 | 0 |
| 0.7694444444444444 | 0 |
| 0.7701388888888889 | 0 |
| 0.7708333333333334 | 0 |
| 0.7715277777777777 | 0 |
| 0.7722222222222223 | 0 |
| 0.7729166666666667 | 0 |
| 0.7736111111111111 | 0 |
| 0.7743055555555555 | 0 |
| 0.775 | 0 |
| 0.7756944444444445 | 0 |
| 0.7763888888888889 | 0 |
| 0.7770833333333332 | 0 |
| 0.7777777777777778 | 0 |
| 0.7784722222222222 | 0 |
| 0.7791666666666667 | 0 |
| 0.779861111111111 | 0 |
| 0.7805555555555556 | 0 |
| 0.78125 | 0 |
| 0.7819444444444444 | 0 |
| 0.782638888888889 | 0 |
| 0.7833333333333333 | 0 |
| 0.7840277777777778 | 0 |
| 0.7847222222222222 | 0 |
| 0.7854166666666668 | 0 |
| 0.7861111111111111 | 0 |
| 0.7868055555555555 | 0 |
| 0.7875 | 0 |
| 0.7881944444444445 | 0 |
| 0.7888888888888889 | 0 |
| 0.7895833333333333 | 0 |
| 0.7902777777777777 | 0 |
| 0.7909722222222223 | 0 |
| 0.7916666666666666 | 0 |
| 0.7923611111111111 | 0 |
| 0.7930555555555556 | 0 |
| 0.7937500000000001 | 0 |
| 0.7944444444444444 | 0 |
| 0.7951388888888888 | 0 |
| 0.7958333333333334 | 0 |
| 0.7965277777777778 | 0 |
| 0.7972222222222222 | 0 |
| 0.7979166666666666 | 0 |
| 0.7986111111111112 | 0 |
| 0.7993055555555556 | 0 |
| 0.7999999999999999 | 0 |
| 0.8006944444444444 | 0 |
| 0.8013888888888889 | 0 |
| 0.8020833333333334 | 0 |
| 0.8027777777777777 | 0 |
| 0.8034722222222223 | 0 |
| 0.8041666666666667 | 0 |
| 0.8048611111111111 | 0 |
| 0.8055555555555555 | 0 |
| 0.80625 | 0 |
| 0.8069444444444445 | 0 |
| 0.8076388888888889 | 0 |
| 0.8083333333333332 | 0 |
| 0.8090277777777778 | 0 |
| 0.8097222222222222 | 0 |
| 0.8104166666666667 | 0 |
| 0.811111111111111 | 0 |
| 0.8118055555555556 | 0 |
| 0.8125 | 0 |
| 0.8131944444444444 | 0 |
| 0.813888888888889 | 0 |
| 0.8145833333333333 | 0 |
| 0.8152777777777778 | 0 |
| 0.8159722222222222 | 0 |
| 0.8166666666666668 | 0 |
| 0.8173611111111111 | 0 |
| 0.8180555555555555 | 0 |
| 0.81875 | 0 |
| 0.8194444444444445 | 0 |
| 0.8201388888888889 | 0 |
| 0.8208333333333333 | 0 |
| 0.8215277777777777 | 0 |
| 0.8222222222222223 | 0 |
| 0.8229166666666666 | 0 |
| 0.8236111111111111 | 0 |
| 0.8243055555555556 | 0 |
| 0.8250000000000001 | 0 |
| 0.8256944444444444 | 0 |
| 0.8263888888888888 | 0 |
| 0.8270833333333334 | 0 |
| 0.8277777777777778 | 0 |
| 0.8284722222222222 | 0 |
| 0.8291666666666666 | 0 |
| 0.8298611111111112 | 0 |
| 0.8305555555555556 | 0 |
| 0.8312499999999999 | 0 |
| 0.8319444444444444 | 0 |
| 0.8326388888888889 | 0 |
| 0.8333333333333334 | 0 |
| 0.8340277777777777 | 0 |
| 0.8347222222222223 | 0 |
| 0.8354166666666667 | 0 |
| 0.8361111111111111 | 0 |
| 0.8368055555555555 | 0 |
| 0.8375 | 0 |
| 0.8381944444444445 | 0 |
| 0.8388888888888889 | 0 |
| 0.8395833333333332 | 0 |
| 0.8402777777777778 | 0 |
| 0.8409722222222222 | 0 |
| 0.8416666666666667 | 0 |
| 0.842361111111111 | 0 |
| 0.8430555555555556 | 0 |
| 0.84375 | 0 |
| 0.8444444444444444 | 0 |
| 0.845138888888889 | 0 |
| 0.8458333333333333 | 0 |
| 0.8465277777777778 | 0 |
| 0.8472222222222222 | 0 |
| 0.8479166666666668 | 0 |
| 0.8486111111111111 | 0 |
| 0.8493055555555555 | 0 |
| 0.85 | 0 |
| 0.8506944444444445 | 0 |
| 0.8513888888888889 | 0 |
| 0.8520833333333333 | 0 |
| 0.8527777777777777 | 0 |
| 0.8534722222222223 | 0 |
| 0.8541666666666666 | 0 |
| 0.8548611111111111 | 0 |
| 0.8555555555555556 | 0 |
| 0.8562500000000001 | 0 |
| 0.8569444444444444 | 0 |
| 0.8576388888888888 | 0 |
| 0.8583333333333334 | 0 |
| 0.8590277777777778 | 0 |
| 0.8597222222222222 | 0 |
| 0.8604166666666666 | 0 |
| 0.8611111111111112 | 0 |
| 0.8618055555555556 | 0 |
| 0.8624999999999999 | 0 |
| 0.8631944444444444 | 0 |
| 0.8638888888888889 | 0 |
| 0.8645833333333334 | 0 |
| 0.8652777777777777 | 0 |
| 0.8659722222222223 | 0 |
| 0.8666666666666667 | 0 |
| 0.8673611111111111 | 0 |
| 0.8680555555555555 | 0 |
| 0.86875 | 0 |
| 0.8694444444444445 | 0 |
| 0.8701388888888889 | 0 |
| 0.8708333333333332 | 0 |
| 0.8715277777777778 | 0 |
| 0.8722222222222222 | 0 |
| 0.8729166666666667 | 0 |
| 0.873611111111111 | 0 |
| 0.8743055555555556 | 0 |
| 0.875 | 0 |
| 0.8756944444444444 | 0 |
| 0.876388888888889 | 0 |
| 0.8770833333333333 | 0 |
| 0.8777777777777778 | 0 |
| 0.8784722222222222 | 0 |
| 0.8791666666666668 | 0 |
| 0.8798611111111111 | 0 |
| 0.8805555555555555 | 0 |
| 0.88125 | 0 |
| 0.8819444444444445 | 0 |
| 0.8826388888888889 | 0 |
| 0.8833333333333333 | 0 |
| 0.8840277777777777 | 0 |
| 0.8847222222222223 | 0 |
| 0.8854166666666666 | 0 |
| 0.8861111111111111 | 0 |
| 0.8868055555555556 | 0 |
| 0.8875000000000001 | 0 |
| 0.8881944444444444 | 0 |
| 0.8888888888888888 | 0 |
| 0.8895833333333334 | 0 |
| 0.8902777777777778 | 0 |
| 0.8909722222222222 | 0 |
| 0.8916666666666666 | 0 |
| 0.8923611111111112 | 0 |
| 0.8930555555555556 | 0 |
| 0.8937499999999999 | 0 |
| 0.8944444444444444 | 0 |
| 0.8951388888888889 | 0 |
| 0.8958333333333334 | 0 |
| 0.8965277777777777 | 0 |
| 0.8972222222222223 | 0 |
| 0.8979166666666667 | 0 |
| 0.8986111111111111 | 0 |
| 0.8993055555555555 | 0 |
| 0.9 | 0 |
| 0.9006944444444445 | 0 |
| 0.9013888888888889 | 0 |
| 0.9020833333333332 | 0 |
| 0.9027777777777778 | 0 |
| 0.9034722222222222 | 0 |
| 0.9041666666666667 | 0 |
| 0.904861111111111 | 0 |
| 0.9055555555555556 | 0 |
| 0.90625 | 0 |
| 0.9069444444444444 | 0 |
| 0.907638888888889 | 0 |
| 0.9083333333333333 | 0 |
| 0.9090277777777778 | 0 |
| 0.9097222222222222 | 0 |
| 0.9104166666666668 | 0 |
| 0.9111111111111111 | 0 |
| 0.9118055555555555 | 0 |
| 0.9125 | 0 |
| 0.9131944444444445 | 0 |
| 0.9138888888888889 | 0 |
| 0.9145833333333333 | 0 |
| 0.9152777777777777 | 0 |
| 0.9159722222222223 | 0 |
| 0.9166666666666666 | 0 |
| 0.9173611111111111 | 0 |
| 0.9180555555555556 | 0 |
| 0.9187500000000001 | 0 |
| 0.9194444444444444 | 0 |
| 0.9201388888888888 | 0 |
| 0.9208333333333334 | 0 |
| 0.9215277777777778 | 0 |
| 0.9222222222222222 | 0 |
| 0.9229166666666666 | 0 |
| 0.9236111111111112 | 0 |
| 0.9243055555555556 | 0 |
| 0.9249999999999999 | 0 |
| 0.9256944444444444 | 0 |
| 0.9263888888888889 | 0 |
| 0.9270833333333334 | 0 |
| 0.9277777777777777 | 0 |
| 0.9284722222222223 | 0 |
| 0.9291666666666667 | 0 |
| 0.9298611111111111 | 0 |
| 0.9305555555555555 | 0 |
| 0.93125 | 0 |
| 0.9319444444444445 | 0 |
| 0.9326388888888889 | 0 |
| 0.9333333333333332 | 0 |
| 0.9340277777777778 | 0 |
| 0.9347222222222222 | 0 |
| 0.9354166666666667 | 0 |
| 0.936111111111111 | 0 |
| 0.9368055555555556 | 0 |
| 0.9375 | 0 |
| 0.9381944444444444 | 0 |
| 0.938888888888889 | 0 |
| 0.9395833333333333 | 0 |
| 0.9402777777777778 | 0 |
| 0.9409722222222222 | 0 |
| 0.9416666666666668 | 0 |
| 0.9423611111111111 | 0 |
| 0.9430555555555555 | 0 |
| 0.94375 | 0 |
| 0.9444444444444445 | 0 |
| 0.9451388888888889 | 0 |
| 0.9458333333333333 | 0 |
| 0.9465277777777777 | 0 |
| 0.9472222222222223 | 0 |
| 0.9479166666666666 | 0 |
| 0.9486111111111111 | 0 |
| 0.9493055555555556 | 0 |
| 0.9500000000000001 | 0 |
| 0.9506944444444444 | 0 |
| 0.9513888888888888 | 0 |
| 0.9520833333333334 | 0 |
| 0.9527777777777778 | 0 |
| 0.9534722222222222 | 0 |
| 0.9541666666666666 | 0 |
| 0.9548611111111112 | 0 |
| 0.9555555555555556 | 0 |
| 0.9562499999999999 | 0 |
| 0.9569444444444444 | 0 |
| 0.9576388888888889 | 0 |
| 0.9583333333333334 | 0 |
| 0.9590277777777777 | 0 |
| 0.9597222222222223 | 0 |
| 0.9604166666666667 | 0 |
| 0.9611111111111111 | 0 |
| 0.9618055555555555 | 0 |
| 0.9625 | 0 |
| 0.9631944444444445 | 0 |
| 0.9638888888888889 | 0 |
| 0.9645833333333332 | 0 |
| 0.9652777777777778 | 0 |
| 0.9659722222222222 | 0 |
| 0.9666666666666667 | 0 |
| 0.967361111111111 | 0 |
| 0.9680555555555556 | 0 |
| 0.96875 | 0 |
| 0.9694444444444444 | 0 |
| 0.970138888888889 | 0 |
| 0.9708333333333333 | 0 |
| 0.9715277777777778 | 0 |
| 0.9722222222222222 | 0 |
| 0.9729166666666668 | 0 |
| 0.9736111111111111 | 0 |
| 0.9743055555555555 | 0 |
| 0.975 | 0 |
| 0.9756944444444445 | 0 |
| 0.9763888888888889 | 0 |
| 0.9770833333333333 | 0 |
| 0.9777777777777777 | 0 |
| 0.9784722222222223 | 0 |
| 0.9791666666666666 | 0 |
| 0.9798611111111111 | 0 |
| 0.9805555555555556 | 0 |
| 0.9812500000000001 | 0 |
| 0.9819444444444444 | 0 |
| 0.9826388888888888 | 0 |
| 0.9833333333333334 | 0 |
| 0.9840277777777778 | 0 |
| 0.9847222222222222 | 0 |
| 0.9854166666666666 | 0 |
| 0.9861111111111112 | 0 |
| 0.9868055555555556 | 0 |
| 0.9874999999999999 | 0 |
| 0.9881944444444444 | 0 |
| 0.9888888888888889 | 0 |
| 0.9895833333333334 | 0 |
| 0.9902777777777777 | 0 |
| 0.9909722222222223 | 0 |
| 0.9916666666666667 | 0 |
| 0.9923611111111111 | 0 |
| 0.9930555555555555 | 0 |
| 0.99375 | 0 |
| 0.9944444444444445 | 0 |
| 0.9951388888888889 | 0 |
| 0.9958333333333332 | 0 |
| 0.9965277777777778 | 0 |
| 0.9972222222222222 | 0 |
| 0.9979166666666667 | 0 |
| 0.998611111111111 | 0 |
| 0.9993055555555556 | 0 |